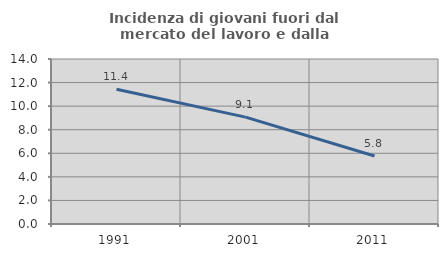
| Category | Incidenza di giovani fuori dal mercato del lavoro e dalla formazione  |
|---|---|
| 1991.0 | 11.433 |
| 2001.0 | 9.071 |
| 2011.0 | 5.774 |